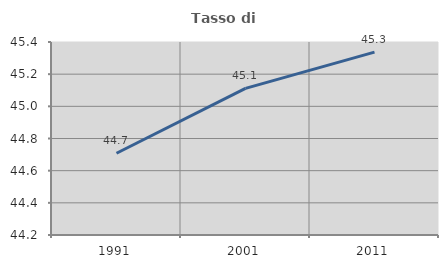
| Category | Tasso di occupazione   |
|---|---|
| 1991.0 | 44.708 |
| 2001.0 | 45.112 |
| 2011.0 | 45.337 |